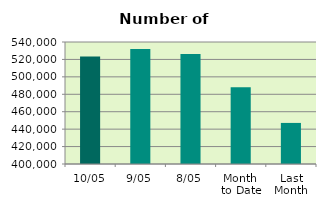
| Category | Series 0 |
|---|---|
| 10/05 | 523286 |
| 9/05 | 532072 |
| 8/05 | 526254 |
| Month 
to Date | 488119.429 |
| Last
Month | 447135.9 |